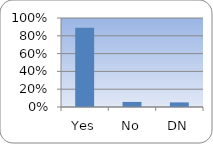
| Category | Series 0 |
|---|---|
| Yes | 0.891 |
| No | 0.057 |
| DN | 0.052 |